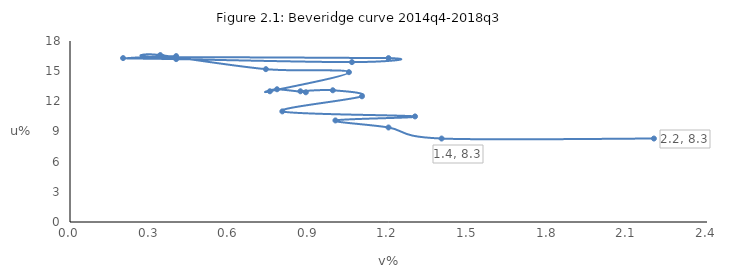
| Category | Unemployment rate |
|---|---|
| 0.4 | 16.5 |
| 0.2 | 16.3 |
| 0.4 | 16.2 |
| 1.0622755726537254 | 15.9 |
| 1.2 | 16.3 |
| 0.35 | 16.4 |
| 0.34 | 16.6 |
| 0.7380688931634313 | 15.2 |
| 1.050916365513681 | 14.9 |
| 0.7531258067497665 | 13 |
| 0.78 | 13.2 |
| 0.8885456784813591 | 12.9 |
| 0.8681469626862016 | 13 |
| 0.9901889240249737 | 13.1 |
| 1.1 | 12.5 |
| 0.8 | 11 |
| 1.3 | 10.5 |
| 1.0 | 10.1 |
| 1.2 | 9.4 |
| 1.4 | 8.3 |
| 2.2 | 8.3 |